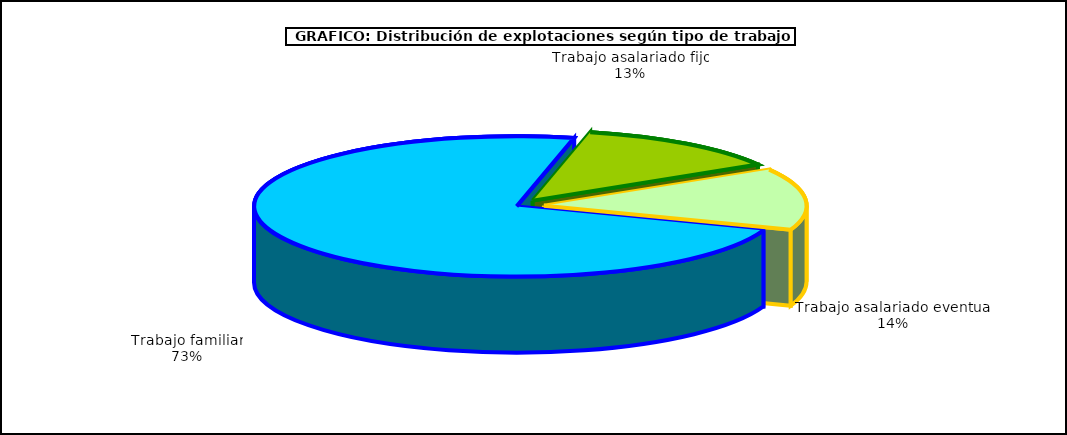
| Category | Series 0 |
|---|---|
| 0 | 903394 |
| 1 | 159494 |
| 2 | 175369 |